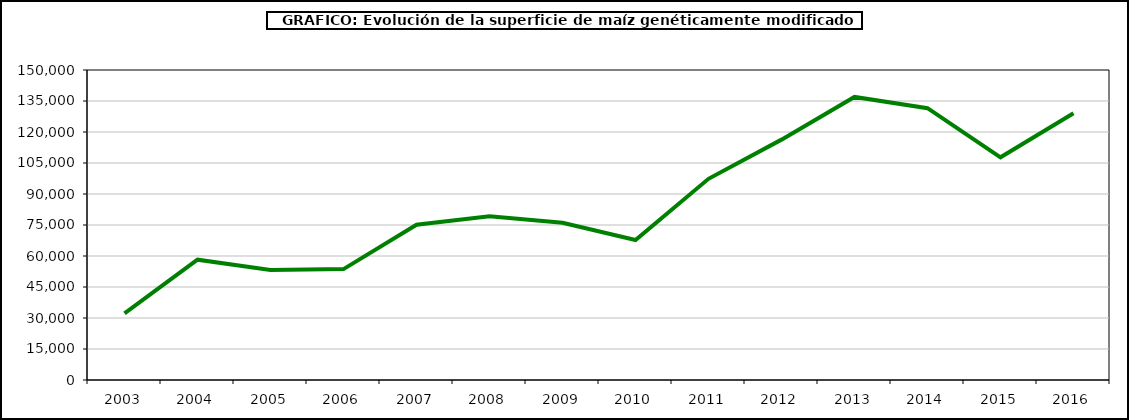
| Category | maiz |
|---|---|
| 2003 | 32249 |
| 2004 | 58219 |
| 2005 | 53226 |
| 2006 | 53667 |
| 2007 | 75148 |
| 2008 | 79269 |
| 2009 | 76057 |
| 2010 | 67726 |
| 2011 | 97346.31 |
| 2012 | 116306.6 |
| 2013 | 136962 |
| 2014 | 131537.67 |
| 2015 | 107749.22 |
| 2016 | 129081.12 |